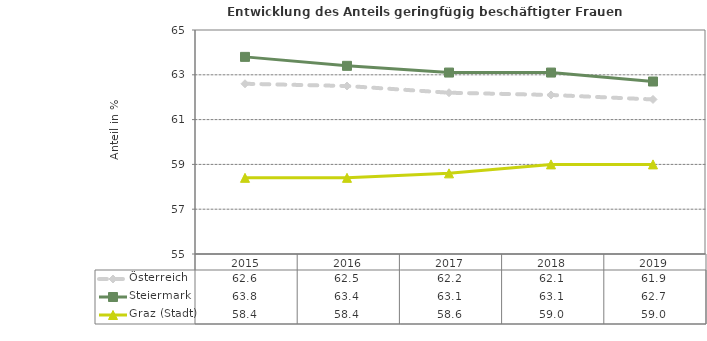
| Category | Österreich | Steiermark | Graz (Stadt) |
|---|---|---|---|
| 2019.0 | 61.9 | 62.7 | 59 |
| 2018.0 | 62.1 | 63.1 | 59 |
| 2017.0 | 62.2 | 63.1 | 58.6 |
| 2016.0 | 62.5 | 63.4 | 58.4 |
| 2015.0 | 62.6 | 63.8 | 58.4 |